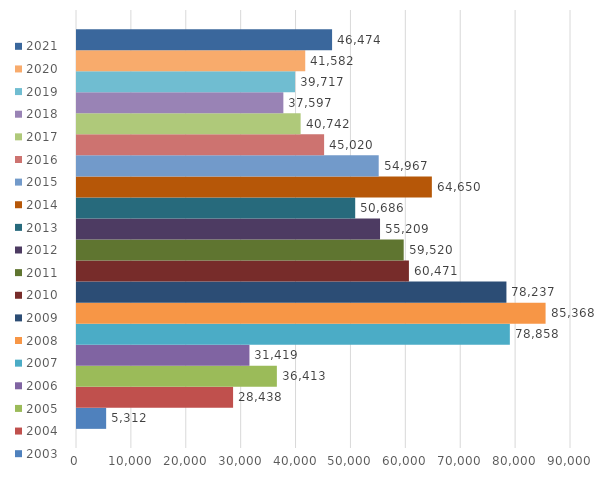
| Category | 2003 | 2004 | 2005 | 2006 | 2007 | 2008 | 2009 | 2010 | 2011 | 2012 | 2013 | 2014 | 2015 | 2016 | 2017 | 2018 | 2019 | 2020 | 2021 |
|---|---|---|---|---|---|---|---|---|---|---|---|---|---|---|---|---|---|---|---|
| 0 | 5312 | 28438 | 36413 | 31419 | 78858 | 85368 | 78237 | 60471 | 59520 | 55209 | 50686 | 64650 | 54967 | 45020 | 40742 | 37597 | 39717 | 41582 | 46474 |